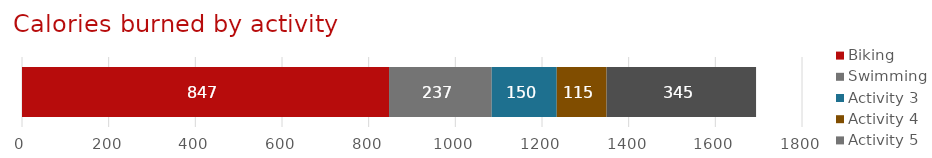
| Category | Biking | Swimming | Activity 3 | Activity 4 | Activity 5 |
|---|---|---|---|---|---|
| Activity Tracker | 847 | 237 | 150 | 115 | 345 |